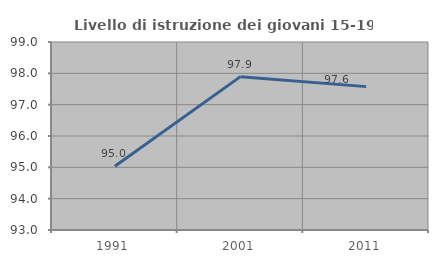
| Category | Livello di istruzione dei giovani 15-19 anni |
|---|---|
| 1991.0 | 95.033 |
| 2001.0 | 97.895 |
| 2011.0 | 97.576 |